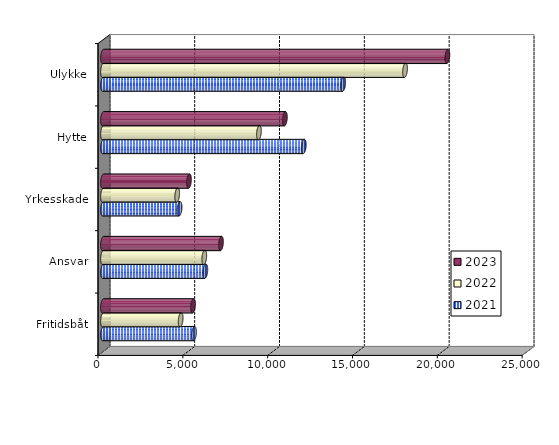
| Category | 2021 | 2022 | 2023 |
|---|---|---|---|
| Fritidsbåt | 5363.97 | 4577.572 | 5306.43 |
| Ansvar | 6032.47 | 5969.292 | 6953.578 |
| Yrkesskade | 4512.347 | 4372.764 | 5067.036 |
| Hytte | 11835 | 9190.961 | 10719.997 |
| Ulykke | 14157.14 | 17803.26 | 20298.702 |